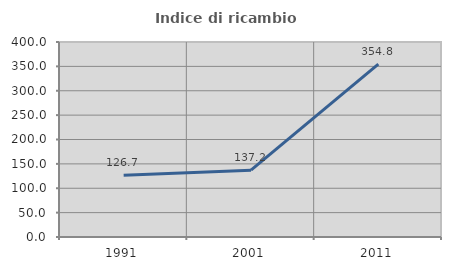
| Category | Indice di ricambio occupazionale  |
|---|---|
| 1991.0 | 126.744 |
| 2001.0 | 137.162 |
| 2011.0 | 354.795 |